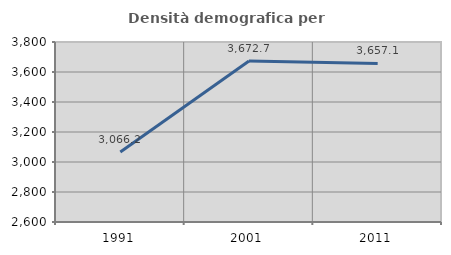
| Category | Densità demografica |
|---|---|
| 1991.0 | 3066.227 |
| 2001.0 | 3672.747 |
| 2011.0 | 3657.147 |